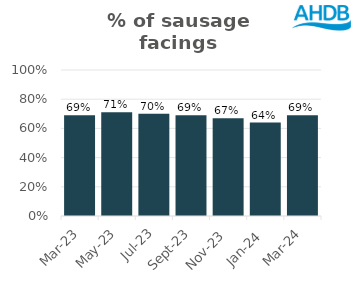
| Category | Sausage |
|---|---|
| 2023-03-01 | 0.69 |
| 2023-05-01 | 0.71 |
| 2023-07-01 | 0.7 |
| 2023-09-01 | 0.69 |
| 2023-11-01 | 0.67 |
| 2024-01-01 | 0.64 |
| 2024-03-01 | 0.69 |